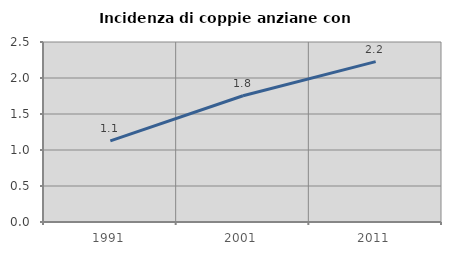
| Category | Incidenza di coppie anziane con figli |
|---|---|
| 1991.0 | 1.128 |
| 2001.0 | 1.753 |
| 2011.0 | 2.227 |